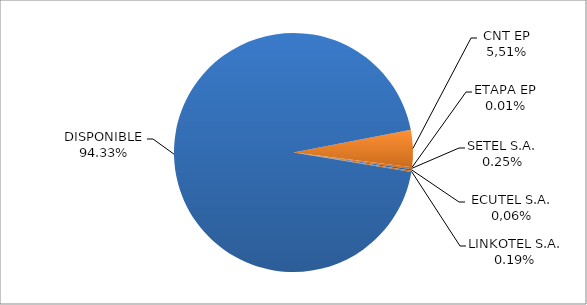
| Category | CODIGO DE AREA 5 |
|---|---|
| CORPORACIÓN NACIONAL TELECOMUNICACIONES CNT EP | 0.05 |
| ETAPA EP | 0 |
| SETEL S.A. | 0.003 |
| CONECEL (ex ECUADORTELECOM S.A.) | 0.002 |
| LINKOTEL S.A. | 0.002 |
| DISPONIBLE | 0.943 |